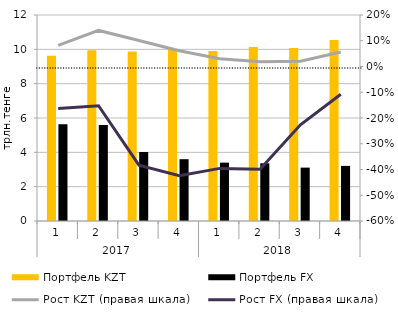
| Category | Портфель KZT | Портфель FX |
|---|---|---|
| 0 | 9.62 | 5.63 |
| 1 | 9.95 | 5.59 |
| 2 | 9.88 | 4.02 |
| 3 | 9.99 | 3.6 |
| 4 | 9.9 | 3.4 |
| 5 | 10.13 | 3.36 |
| 6 | 10.08 | 3.11 |
| 7 | 10.55 | 3.21 |